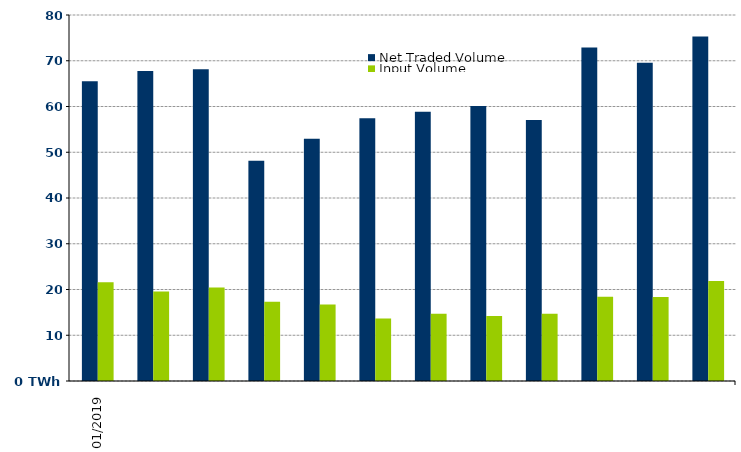
| Category | Net Traded Volume | Input Volume |
|---|---|---|
| 2019-01-01 | 65.493 | 21.56 |
| 2019-02-01 | 67.768 | 19.553 |
| 2019-03-01 | 68.145 | 20.462 |
| 2019-04-01 | 48.126 | 17.298 |
| 2019-05-01 | 52.975 | 16.712 |
| 2019-06-01 | 57.432 | 13.653 |
| 2019-07-01 | 58.855 | 14.704 |
| 2019-08-01 | 60.119 | 14.216 |
| 2019-09-01 | 57.044 | 14.716 |
| 2019-10-01 | 72.876 | 18.39 |
| 2019-11-01 | 69.588 | 18.359 |
| 2019-12-01 | 75.302 | 21.87 |